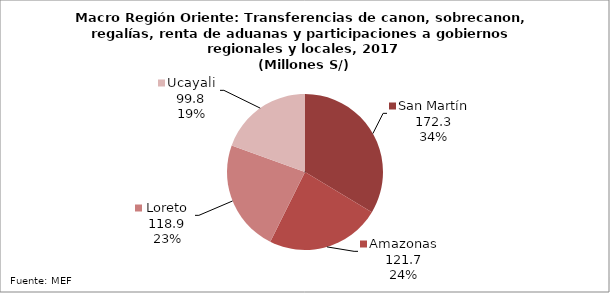
| Category | Series 0 |
|---|---|
| San Martín | 172.259 |
| Amazonas | 121.74 |
| Loreto | 118.882 |
| Ucayali | 99.789 |